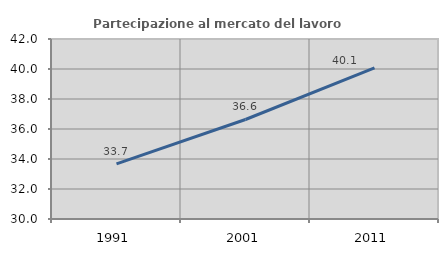
| Category | Partecipazione al mercato del lavoro  femminile |
|---|---|
| 1991.0 | 33.67 |
| 2001.0 | 36.634 |
| 2011.0 | 40.072 |